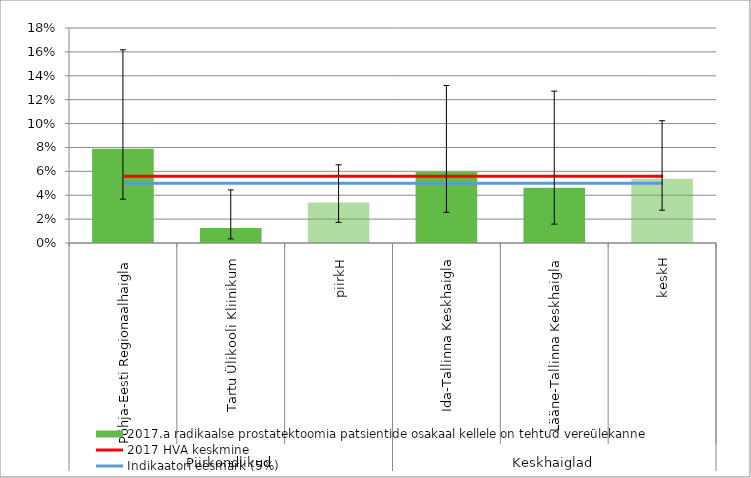
| Category | 2017.a radikaalse prostatektoomia patsientide osakaal kellele on tehtud vereülekanne |
|---|---|
| 0 | 0.079 |
| 1 | 0.012 |
| 2 | 0.034 |
| 3 | 0.06 |
| 4 | 0.046 |
| 5 | 0.054 |